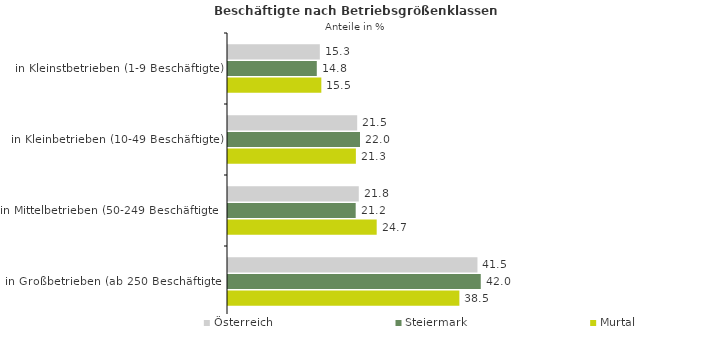
| Category | Österreich | Steiermark | Murtal |
|---|---|---|---|
| in Kleinstbetrieben (1-9 Beschäftigte) | 15.273 | 14.768 | 15.522 |
| in Kleinbetrieben (10-49 Beschäftigte) | 21.487 | 21.955 | 21.268 |
| in Mittelbetrieben (50-249 Beschäftigte) | 21.75 | 21.237 | 24.73 |
| in Großbetrieben (ab 250 Beschäftigte) | 41.489 | 42.04 | 38.482 |